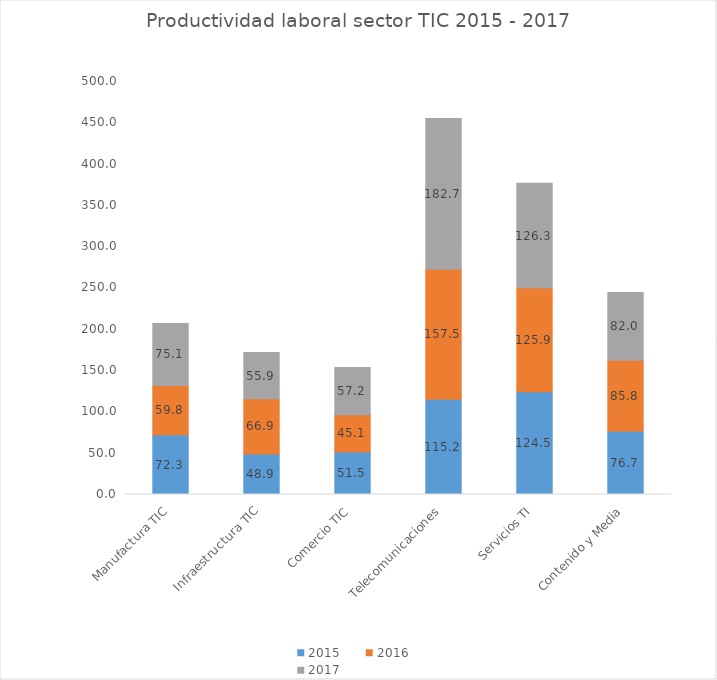
| Category | 2015 | 2016 | 2017 |
|---|---|---|---|
| Manufactura TIC | 72.266 | 59.782 | 75.101 |
| Infraestructura TIC | 48.92 | 66.909 | 55.939 |
| Comercio TIC | 51.459 | 45.143 | 57.17 |
| Telecomunicaciones | 115.178 | 157.453 | 182.707 |
| Servicios TI | 124.486 | 125.861 | 126.341 |
| Contenido y Media | 76.662 | 85.783 | 82.022 |